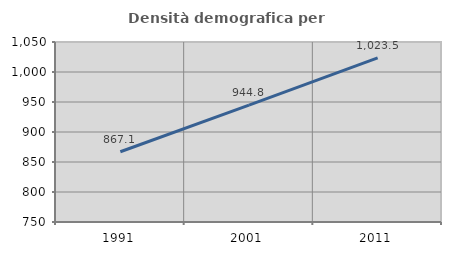
| Category | Densità demografica |
|---|---|
| 1991.0 | 867.092 |
| 2001.0 | 944.793 |
| 2011.0 | 1023.547 |